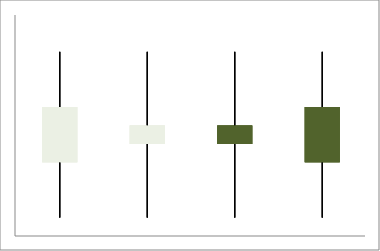
| Category | Series 1 | Series 2 | Series 3 | Series 4 |
|---|---|---|---|---|
| Point 1 | 20 | 50 | 5 | 35 |
| Point 2 | 25 | 50 | 5 | 30 |
| Point 3 | 30 | 50 | 5 | 25 |
| Point 4 | 35 | 50 | 5 | 20 |